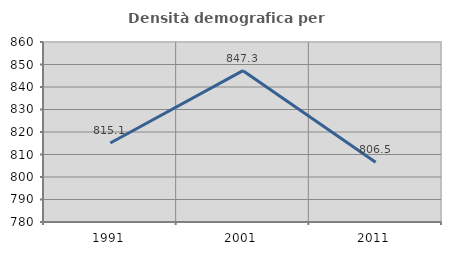
| Category | Densità demografica |
|---|---|
| 1991.0 | 815.114 |
| 2001.0 | 847.255 |
| 2011.0 | 806.518 |